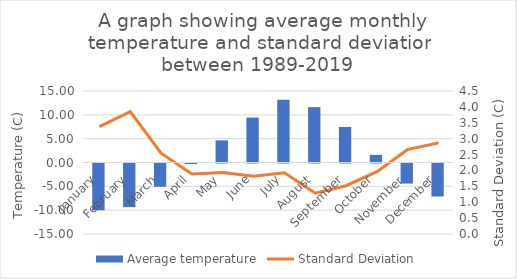
| Category | Average temperature |
|---|---|
| January | -9.8 |
| February | -9.161 |
| March | -4.881 |
| April | -0.116 |
| May | 4.639 |
| June | 9.432 |
| July | 13.177 |
| August | 11.613 |
| September | 7.445 |
| October | 1.597 |
| November | -4.203 |
| December | -6.923 |